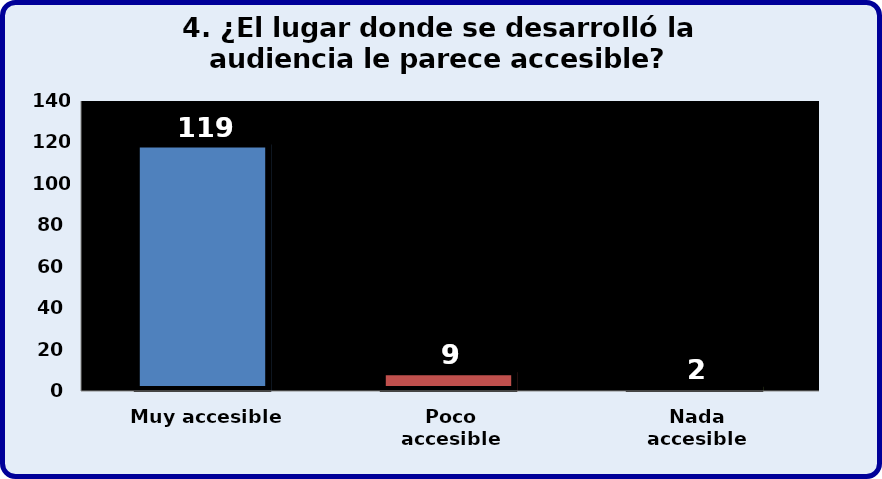
| Category | Series 0 |
|---|---|
| Muy accesible | 119 |
| Poco accesible | 9 |
| Nada accesible | 2 |